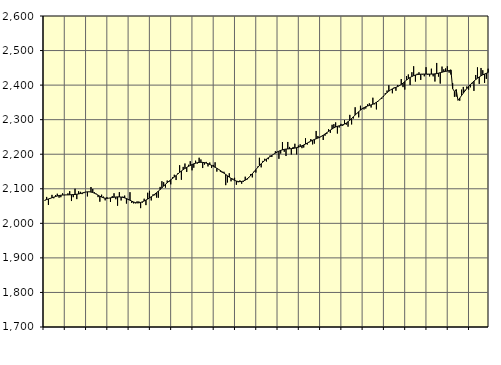
| Category | Piggar | Series 1 |
|---|---|---|
| nan | 2065.5 | 2067.15 |
| 1.0 | 2076.4 | 2068.86 |
| 1.0 | 2053.3 | 2070.5 |
| 1.0 | 2073.1 | 2072.2 |
| 1.0 | 2082.4 | 2073.96 |
| 1.0 | 2072.5 | 2075.69 |
| 1.0 | 2081.6 | 2077.54 |
| 1.0 | 2085.7 | 2079.04 |
| 1.0 | 2074.3 | 2080.4 |
| 1.0 | 2075.6 | 2081.34 |
| 1.0 | 2086.9 | 2081.89 |
| 1.0 | 2081.4 | 2082.15 |
| nan | 2082.7 | 2082.22 |
| 2.0 | 2086.7 | 2082.32 |
| 2.0 | 2093.1 | 2082.53 |
| 2.0 | 2064.5 | 2082.85 |
| 2.0 | 2075.7 | 2083.17 |
| 2.0 | 2100.1 | 2083.56 |
| 2.0 | 2070.1 | 2084.14 |
| 2.0 | 2092.8 | 2085 |
| 2.0 | 2091.2 | 2086.24 |
| 2.0 | 2084.6 | 2087.76 |
| 2.0 | 2087.3 | 2089.25 |
| 2.0 | 2090.8 | 2090.48 |
| nan | 2077.9 | 2091.2 |
| 3.0 | 2090.7 | 2091.23 |
| 3.0 | 2105.1 | 2090.53 |
| 3.0 | 2099.4 | 2089.14 |
| 3.0 | 2089.8 | 2087.1 |
| 3.0 | 2085.7 | 2084.52 |
| 3.0 | 2075.9 | 2081.61 |
| 3.0 | 2062.6 | 2078.7 |
| 3.0 | 2082.9 | 2076.05 |
| 3.0 | 2077.4 | 2073.99 |
| 3.0 | 2066.5 | 2072.72 |
| 3.0 | 2075.7 | 2072.34 |
| nan | 2073 | 2072.79 |
| 4.0 | 2061.8 | 2073.7 |
| 4.0 | 2078.7 | 2074.71 |
| 4.0 | 2087 | 2075.59 |
| 4.0 | 2069.7 | 2076.24 |
| 4.0 | 2051 | 2076.55 |
| 4.0 | 2090.1 | 2076.46 |
| 4.0 | 2066.2 | 2076.01 |
| 4.0 | 2077.3 | 2075.13 |
| 4.0 | 2080.3 | 2073.66 |
| 4.0 | 2057.2 | 2071.76 |
| 4.0 | 2067.3 | 2069.46 |
| nan | 2090.1 | 2066.82 |
| 5.0 | 2058.9 | 2064.19 |
| 5.0 | 2057.8 | 2061.87 |
| 5.0 | 2057.8 | 2060.1 |
| 5.0 | 2063.6 | 2059.19 |
| 5.0 | 2063.3 | 2059.38 |
| 5.0 | 2044 | 2060.51 |
| 5.0 | 2060.1 | 2062.31 |
| 5.0 | 2071.2 | 2064.61 |
| 5.0 | 2052.7 | 2067.28 |
| 5.0 | 2088.5 | 2070.24 |
| 5.0 | 2093.8 | 2073.48 |
| nan | 2066.3 | 2076.93 |
| 6.0 | 2083.7 | 2080.58 |
| 6.0 | 2081 | 2084.49 |
| 6.0 | 2074.5 | 2088.72 |
| 6.0 | 2074.1 | 2093.23 |
| 6.0 | 2105.4 | 2097.89 |
| 6.0 | 2121.9 | 2102.8 |
| 6.0 | 2119 | 2107.85 |
| 6.0 | 2103.4 | 2112.76 |
| 6.0 | 2123.8 | 2117.47 |
| 6.0 | 2119.5 | 2121.91 |
| 6.0 | 2112.8 | 2125.96 |
| nan | 2133.2 | 2129.88 |
| 7.0 | 2140.6 | 2134 |
| 7.0 | 2125.3 | 2138.3 |
| 7.0 | 2144.9 | 2142.81 |
| 7.0 | 2168.2 | 2147.34 |
| 7.0 | 2126.1 | 2151.6 |
| 7.0 | 2163.3 | 2155.42 |
| 7.0 | 2173.1 | 2158.83 |
| 7.0 | 2148.8 | 2161.93 |
| 7.0 | 2169.4 | 2164.85 |
| 7.0 | 2179.8 | 2167.52 |
| 7.0 | 2153.4 | 2170.02 |
| nan | 2160.9 | 2172.27 |
| 8.0 | 2181.3 | 2174.05 |
| 8.0 | 2173 | 2175.38 |
| 8.0 | 2189.8 | 2176.26 |
| 8.0 | 2184.8 | 2176.59 |
| 8.0 | 2160 | 2176.37 |
| 8.0 | 2170 | 2175.64 |
| 8.0 | 2177.7 | 2174.32 |
| 8.0 | 2164.7 | 2172.51 |
| 8.0 | 2176 | 2170.28 |
| 8.0 | 2160 | 2167.74 |
| 8.0 | 2169.1 | 2165.01 |
| nan | 2176.7 | 2162.18 |
| 9.0 | 2149.7 | 2159.23 |
| 9.0 | 2155.5 | 2156.06 |
| 9.0 | 2149.2 | 2152.64 |
| 9.0 | 2146.4 | 2148.99 |
| 9.0 | 2149.2 | 2145.22 |
| 9.0 | 2110.5 | 2141.38 |
| 9.0 | 2118.3 | 2137.52 |
| 9.0 | 2144.9 | 2133.76 |
| 9.0 | 2121.6 | 2130.21 |
| 9.0 | 2129.6 | 2127.02 |
| 9.0 | 2131.8 | 2124.36 |
| nan | 2111.7 | 2122.33 |
| 10.0 | 2118.8 | 2121.07 |
| 10.0 | 2124.2 | 2120.63 |
| 10.0 | 2114.6 | 2121.1 |
| 10.0 | 2120.6 | 2122.55 |
| 10.0 | 2134.9 | 2124.98 |
| 10.0 | 2126.3 | 2128.39 |
| 10.0 | 2130.9 | 2132.75 |
| 10.0 | 2142.3 | 2137.84 |
| 10.0 | 2132.9 | 2143.46 |
| 10.0 | 2150.5 | 2149.45 |
| 10.0 | 2146.9 | 2155.51 |
| nan | 2164.1 | 2161.44 |
| 11.0 | 2189.7 | 2167.16 |
| 11.0 | 2162 | 2172.55 |
| 11.0 | 2180.7 | 2177.44 |
| 11.0 | 2186.8 | 2181.87 |
| 11.0 | 2179 | 2185.97 |
| 11.0 | 2185.5 | 2189.71 |
| 11.0 | 2196.3 | 2193.2 |
| 11.0 | 2192 | 2196.6 |
| 11.0 | 2199.4 | 2199.95 |
| 11.0 | 2208.7 | 2203.17 |
| 11.0 | 2207.4 | 2206.21 |
| nan | 2186.7 | 2208.92 |
| 12.0 | 2201.9 | 2211.11 |
| 12.0 | 2235.3 | 2212.76 |
| 12.0 | 2207.1 | 2214.02 |
| 12.0 | 2194.8 | 2214.83 |
| 12.0 | 2235.5 | 2215.33 |
| 12.0 | 2221.1 | 2215.73 |
| 12.0 | 2199.2 | 2216.13 |
| 12.0 | 2221 | 2216.73 |
| 12.0 | 2230.3 | 2217.71 |
| 12.0 | 2199.6 | 2218.98 |
| 12.0 | 2225.1 | 2220.48 |
| nan | 2228.7 | 2222.28 |
| 13.0 | 2217.5 | 2224.38 |
| 13.0 | 2219.4 | 2226.81 |
| 13.0 | 2246.2 | 2229.49 |
| 13.0 | 2227.9 | 2232.4 |
| 13.0 | 2234.4 | 2235.31 |
| 13.0 | 2243.9 | 2238 |
| 13.0 | 2228.4 | 2240.48 |
| 13.0 | 2230.7 | 2242.71 |
| 13.0 | 2267.3 | 2244.67 |
| 13.0 | 2252.8 | 2246.71 |
| 13.0 | 2247.7 | 2249.12 |
| nan | 2252.8 | 2251.89 |
| 14.0 | 2241.2 | 2255.07 |
| 14.0 | 2253.5 | 2258.58 |
| 14.0 | 2258.3 | 2262.26 |
| 14.0 | 2272.5 | 2266.01 |
| 14.0 | 2261.9 | 2269.67 |
| 14.0 | 2285.2 | 2273.12 |
| 14.0 | 2287 | 2276.24 |
| 14.0 | 2292.1 | 2278.83 |
| 14.0 | 2259.9 | 2280.78 |
| 14.0 | 2277.3 | 2282.26 |
| 14.0 | 2287.9 | 2283.62 |
| nan | 2281.9 | 2285.2 |
| 15.0 | 2298.8 | 2287.34 |
| 15.0 | 2285.4 | 2290.3 |
| 15.0 | 2279.7 | 2294.03 |
| 15.0 | 2313.9 | 2298.41 |
| 15.0 | 2286.2 | 2303.28 |
| 15.0 | 2303.3 | 2308.33 |
| 15.0 | 2335.9 | 2313.31 |
| 15.0 | 2318.9 | 2318.22 |
| 15.0 | 2306.6 | 2322.99 |
| 15.0 | 2340.3 | 2327.49 |
| 15.0 | 2333.9 | 2331.45 |
| nan | 2329.6 | 2334.76 |
| 16.0 | 2332.2 | 2337.41 |
| 16.0 | 2344.4 | 2339.48 |
| 16.0 | 2347.3 | 2341.19 |
| 16.0 | 2335.2 | 2342.8 |
| 16.0 | 2363.5 | 2344.67 |
| 16.0 | 2344.4 | 2347.12 |
| 16.0 | 2329.7 | 2350.25 |
| 16.0 | 2353.4 | 2354.03 |
| 16.0 | 2358.7 | 2358.47 |
| 16.0 | 2359.9 | 2363.32 |
| 16.0 | 2365.9 | 2368.32 |
| nan | 2377 | 2373.4 |
| 17.0 | 2384.3 | 2378.26 |
| 17.0 | 2399.5 | 2382.55 |
| 17.0 | 2386.1 | 2386.18 |
| 17.0 | 2376.4 | 2389.14 |
| 17.0 | 2393.2 | 2391.48 |
| 17.0 | 2383.7 | 2393.55 |
| 17.0 | 2400.4 | 2395.83 |
| 17.0 | 2399.8 | 2398.57 |
| 17.0 | 2417.6 | 2401.89 |
| 17.0 | 2394.2 | 2405.81 |
| 17.0 | 2387 | 2410.16 |
| nan | 2426.2 | 2414.52 |
| 18.0 | 2430.8 | 2418.56 |
| 18.0 | 2400.2 | 2422.1 |
| 18.0 | 2437.3 | 2424.97 |
| 18.0 | 2454.6 | 2427.28 |
| 18.0 | 2410.2 | 2429.15 |
| 18.0 | 2433.1 | 2430.43 |
| 18.0 | 2437.1 | 2431.2 |
| 18.0 | 2415.1 | 2431.67 |
| 18.0 | 2430.8 | 2431.91 |
| 18.0 | 2425.5 | 2431.98 |
| 18.0 | 2451.9 | 2432 |
| nan | 2429.8 | 2431.94 |
| 19.0 | 2425.2 | 2431.8 |
| 19.0 | 2447.5 | 2431.85 |
| 19.0 | 2425.4 | 2432.11 |
| 19.0 | 2410.4 | 2432.54 |
| 19.0 | 2464.1 | 2433.33 |
| 19.0 | 2424.6 | 2434.52 |
| 19.0 | 2404.4 | 2435.94 |
| 19.0 | 2453.6 | 2437.36 |
| 19.0 | 2445.6 | 2438.64 |
| 19.0 | 2448.3 | 2439.72 |
| 19.0 | 2454.5 | 2440.74 |
| nan | 2436 | 2442.02 |
| 20.0 | 2430.7 | 2444.05 |
| 20.0 | 2406 | 2389.83 |
| 20.0 | 2366.2 | 2381.58 |
| 20.0 | 2366.5 | 2387.03 |
| 20.0 | 2355.8 | 2355.68 |
| 20.0 | 2354.8 | 2362.47 |
| 20.0 | 2386.9 | 2369.63 |
| 20.0 | 2394.7 | 2376.73 |
| 20.0 | 2386.7 | 2383.51 |
| 20.0 | 2396.1 | 2389.99 |
| 20.0 | 2386.6 | 2396 |
| nan | 2393.5 | 2401.58 |
| 21.0 | 2404.2 | 2406.78 |
| 21.0 | 2383.2 | 2411.54 |
| 21.0 | 2429.3 | 2415.86 |
| 21.0 | 2451.4 | 2419.91 |
| 21.0 | 2403.4 | 2423.63 |
| 21.0 | 2449.6 | 2426.9 |
| 21.0 | 2443.1 | 2429.7 |
| 21.0 | 2406.5 | 2432.05 |
| 21.0 | 2418 | 2434.19 |
| 21.0 | 2447.5 | 2436.39 |